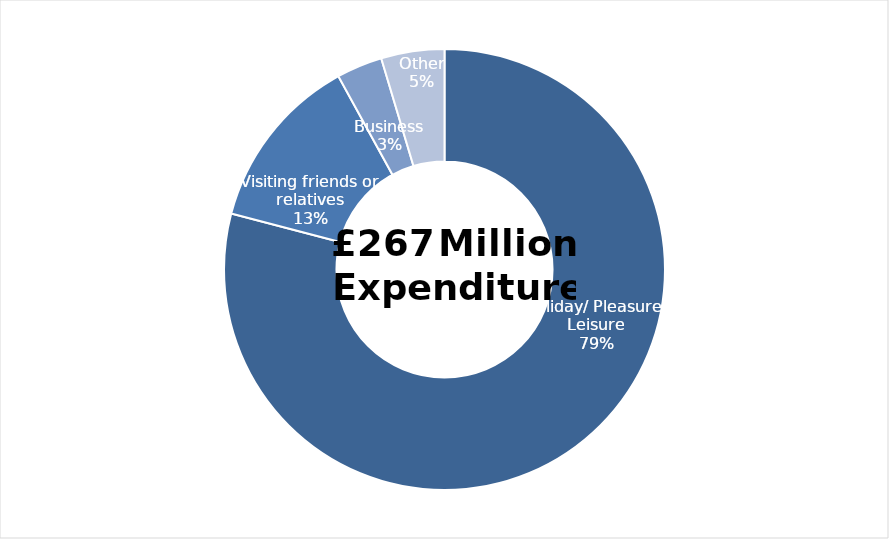
| Category | Series 0 |
|---|---|
| Holiday/ Pleasure/ Leisure | 210911200.45 |
| Visiting friends or relatives | 34468898.25 |
| Business | 8959599.62 |
| Other | 12353628.39 |